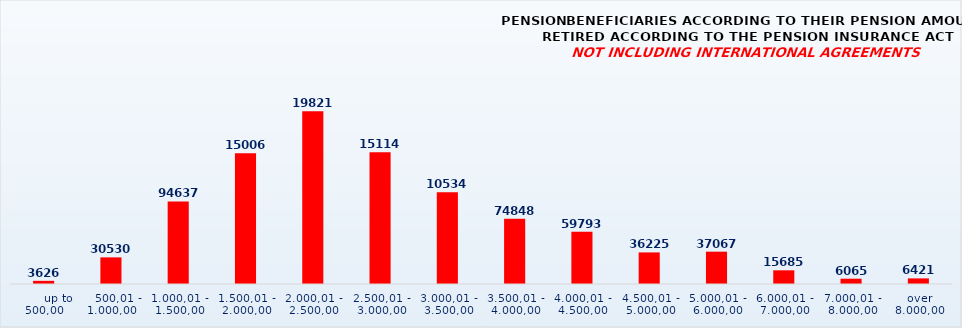
| Category | PENSION BENEFICIARIES ACCORDING TO TYPES AND AMOUNTS OF PENSION, RETIRED ACCORDING TO THE PENSION INSURANCE ACT
NOT INCLUDING INTERNATIONAL AGREEMENTS |
|---|---|
|       up to 500,00 | 3626 |
|    500,01 - 1.000,00 | 30530 |
| 1.000,01 - 1.500,00 | 94637 |
| 1.500,01 - 2.000,00 | 150060 |
| 2.000,01 - 2.500,00 | 198210 |
| 2.500,01 - 3.000,00 | 151144 |
| 3.000,01 - 3.500,00 | 105348 |
| 3.500,01 - 4.000,00 | 74848 |
| 4.000,01 - 4.500,00 | 59793 |
| 4.500,01 - 5.000,00 | 36225 |
| 5.000,01 - 6.000,00 | 37067 |
| 6.000,01 - 7.000,00 | 15685 |
| 7.000,01 - 8.000,00 | 6065 |
|  over  8.000,00 | 6421 |